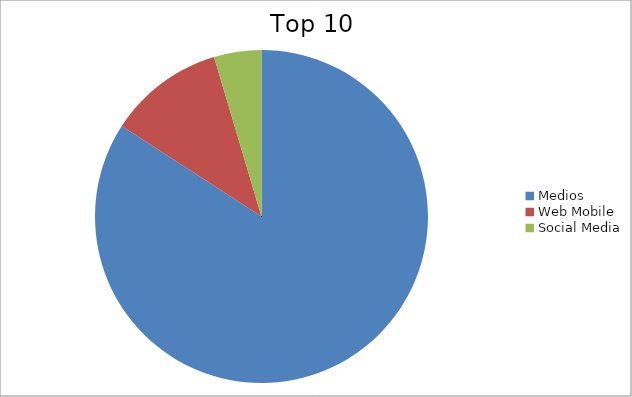
| Category | Series 0 |
|---|---|
| Medios | 84.14 |
| Web Mobile | 11.26 |
| Social Media | 4.6 |